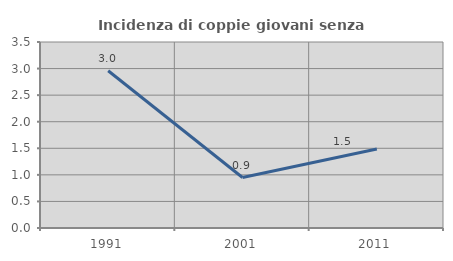
| Category | Incidenza di coppie giovani senza figli |
|---|---|
| 1991.0 | 2.959 |
| 2001.0 | 0.949 |
| 2011.0 | 1.487 |